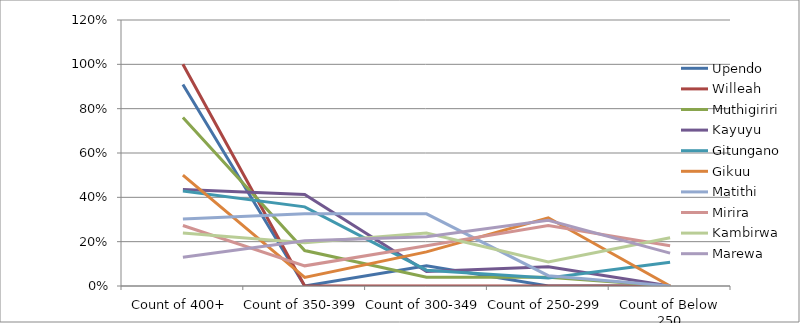
| Category | Upendo | Willeah | Muthigiriri | Kayuyu | Gitungano | Gikuu | Matithi | Mirira | Kambirwa | Marewa |
|---|---|---|---|---|---|---|---|---|---|---|
| Count of 400+ | 0.909 | 1 | 0.76 | 0.435 | 0.429 | 0.5 | 0.302 | 0.273 | 0.239 | 0.13 |
| Count of 350-399 | 0 | 0 | 0.16 | 0.413 | 0.357 | 0.038 | 0.326 | 0.091 | 0.196 | 0.204 |
| Count of 300-349 | 0.091 | 0 | 0.04 | 0.065 | 0.071 | 0.154 | 0.326 | 0.182 | 0.239 | 0.222 |
| Count of 250-299 | 0 | 0 | 0.04 | 0.087 | 0.036 | 0.308 | 0.047 | 0.273 | 0.109 | 0.296 |
| Count of Below 250 | 0 | 0 | 0 | 0 | 0.107 | 0 | 0 | 0.182 | 0.217 | 0.148 |